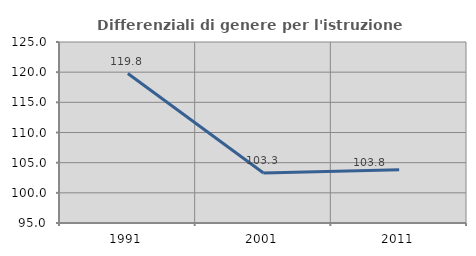
| Category | Differenziali di genere per l'istruzione superiore |
|---|---|
| 1991.0 | 119.771 |
| 2001.0 | 103.29 |
| 2011.0 | 103.809 |